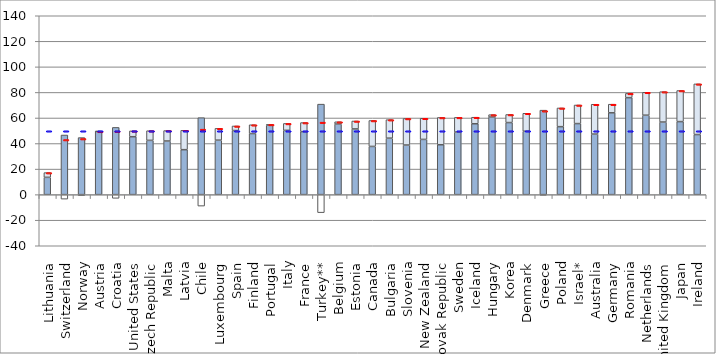
| Category | Gross Earnings | Net taxes | Net transfers |
|---|---|---|---|
| Lithuania | 13.544 | 0 | 3.708 |
| Switzerland | 46.669 | -3.52 | 0 |
| Norway | 44.65 | -0.746 | 0 |
| Austria | 49.485 | 0 | 0.08 |
| Croatia | 52.627 | -2.891 | 0 |
| United States | 45.348 | 0 | 4.557 |
| Czech Republic | 42.485 | 0 | 7.554 |
| Malta | 41.977 | 0 | 8.17 |
| Latvia | 35.195 | 0 | 15.17 |
| Chile | 60.228 | -8.975 | 0 |
| Luxembourg | 42.642 | 0 | 9.237 |
| Spain | 50.177 | 0 | 3.568 |
| Finland | 47.82 | 0 | 6.872 |
| Portugal | 54.301 | 0 | 0.655 |
| Italy | 50.323 | 0 | 5.402 |
| France | 49.304 | 0 | 7.111 |
| Turkey** | 70.828 | -14.093 | 0 |
| Belgium | 55.261 | 0 | 1.764 |
| Estonia | 51.432 | 0 | 6.207 |
| Canada | 37.724 | 0 | 20.317 |
| Bulgaria | 44.196 | 0 | 14.483 |
| Slovenia | 38.835 | 0 | 20.779 |
| New Zealand | 43.229 | 0 | 16.532 |
| Slovak Republic | 39.064 | 0 | 21.337 |
| Sweden | 48.976 | 0 | 11.494 |
| Iceland | 55.486 | 0 | 5.108 |
| Hungary | 60.732 | 0 | 1.86 |
| Korea | 56.408 | 0 | 6.314 |
| Denmark | 49.622 | 0 | 14.057 |
| Greece | 66.119 | -0.452 | 0 |
| Poland | 53.21 | 0 | 14.634 |
| Israel* | 55.617 | 0 | 14.545 |
| Australia | 47.394 | 0 | 23.351 |
| Germany | 64.046 | 0 | 6.734 |
| Romania | 75.924 | 0 | 3.319 |
| Netherlands | 62.17 | 0 | 17.94 |
| United Kingdom | 56.816 | 0 | 23.758 |
| Japan | 57.175 | 0 | 24.317 |
| Ireland | 47.023 | 0 | 39.656 |